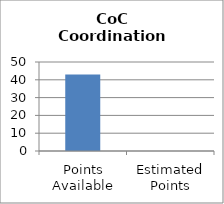
| Category | CoC Coordination and Engagement |
|---|---|
| Points Available | 43 |
| Estimated Points | 0 |